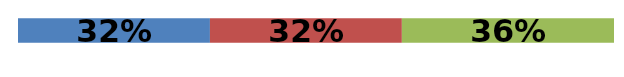
| Category | Series 0 | Series 1 | Series 2 |
|---|---|---|---|
| 0 | 0.322 | 0.322 | 0.356 |